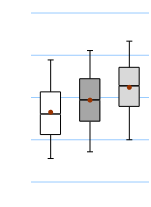
| Category | 25th | 50th | 75th |
|---|---|---|---|
| UK | 27.778 | 12.302 | 13.254 |
| Top 50% | 35.714 | 12.698 | 12.698 |
| Top 10% | 44.444 | 12.302 | 11.111 |